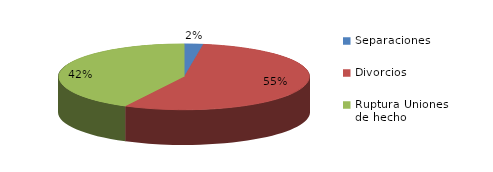
| Category | Series 0 |
|---|---|
| Separaciones | 11 |
| Divorcios | 252 |
| Ruptura Uniones de hecho | 193 |